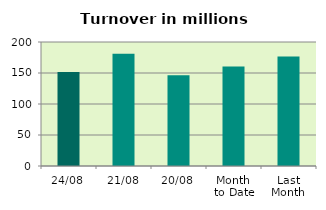
| Category | Series 0 |
|---|---|
| 24/08 | 151.475 |
| 21/08 | 181.198 |
| 20/08 | 146.289 |
| Month 
to Date | 160.413 |
| Last
Month | 176.477 |